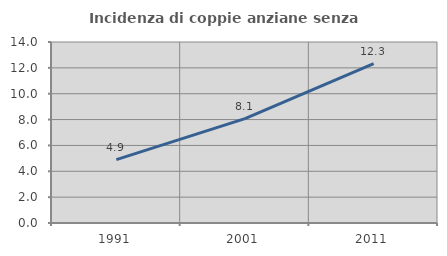
| Category | Incidenza di coppie anziane senza figli  |
|---|---|
| 1991.0 | 4.905 |
| 2001.0 | 8.073 |
| 2011.0 | 12.322 |